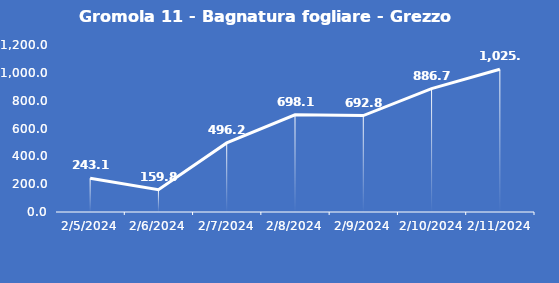
| Category | Gromola 11 - Bagnatura fogliare - Grezzo (min) |
|---|---|
| 2/5/24 | 243.1 |
| 2/6/24 | 159.8 |
| 2/7/24 | 496.2 |
| 2/8/24 | 698.1 |
| 2/9/24 | 692.8 |
| 2/10/24 | 886.7 |
| 2/11/24 | 1025.4 |